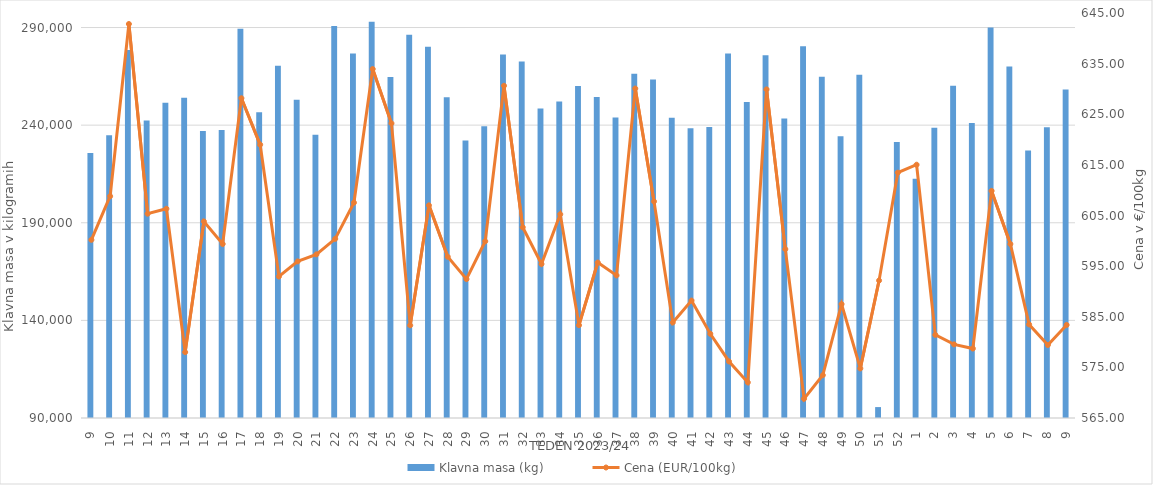
| Category | Klavna masa (kg) |
|---|---|
| 9.0 | 225712 |
| 10.0 | 234762 |
| 11.0 | 278467 |
| 12.0 | 242369 |
| 13.0 | 251507 |
| 14.0 | 254072 |
| 15.0 | 236964 |
| 16.0 | 237552 |
| 17.0 | 289400 |
| 18.0 | 246616 |
| 19.0 | 270374 |
| 20.0 | 252984 |
| 21.0 | 235060 |
| 22.0 | 290816 |
| 23.0 | 276702 |
| 24.0 | 292976 |
| 25.0 | 264669 |
| 26.0 | 286237 |
| 27.0 | 280112 |
| 28.0 | 254336 |
| 29.0 | 232178 |
| 30.0 | 239437 |
| 31.0 | 276163 |
| 32.0 | 272647 |
| 33.0 | 248536 |
| 34.0 | 252050 |
| 35.0 | 260110 |
| 36.0 | 254389 |
| 37.0 | 243933 |
| 38.0 | 266321 |
| 39.0 | 263346 |
| 40.0 | 243765 |
| 41.0 | 238404 |
| 42.0 | 239007 |
| 43.0 | 276684 |
| 44.0 | 251832 |
| 45.0 | 275816 |
| 46.0 | 243425 |
| 47.0 | 280350 |
| 48.0 | 264849 |
| 49.0 | 234308 |
| 50.0 | 265786 |
| 51.0 | 95590 |
| 52.0 | 231370 |
| 1.0 | 212581 |
| 2.0 | 238607 |
| 3.0 | 260140 |
| 4.0 | 241148 |
| 5.0 | 290049 |
| 6.0 | 270025 |
| 7.0 | 227057 |
| 8.0 | 238927 |
| 9.0 | 258215 |